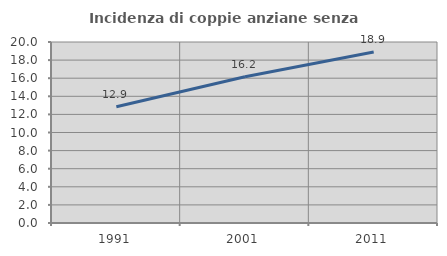
| Category | Incidenza di coppie anziane senza figli  |
|---|---|
| 1991.0 | 12.854 |
| 2001.0 | 16.165 |
| 2011.0 | 18.891 |